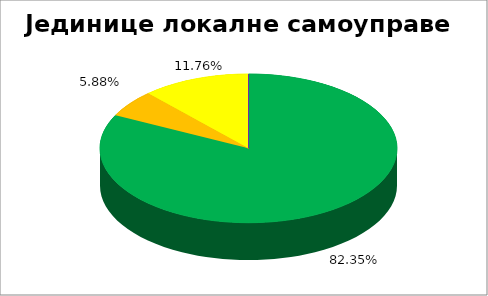
| Category | Jединице локалне самоуправе |
|---|---|
| 0 | 0.824 |
| 1 | 0.059 |
| 2 | 0.118 |
| 3 | 0 |
| 4 | 0 |